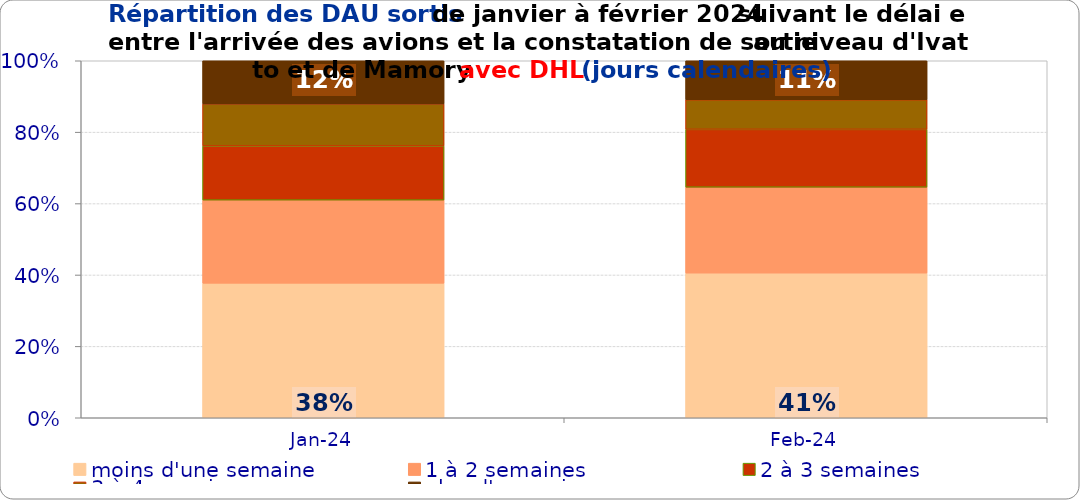
| Category | moins d'une semaine | 1 à 2 semaines | 2 à 3 semaines | 3 à 4 semaines | plus d'un mois |
|---|---|---|---|---|---|
| 2024-01-01 | 0.377 | 0.233 | 0.152 | 0.118 | 0.121 |
| 2024-02-01 | 0.405 | 0.241 | 0.162 | 0.083 | 0.109 |